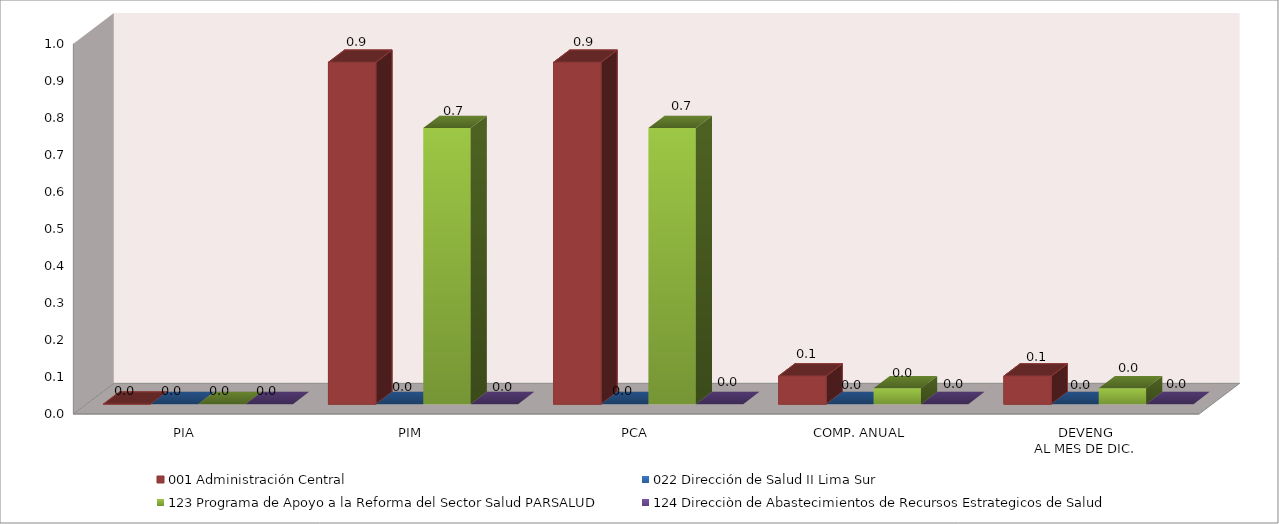
| Category | 001 Administración Central | 022 Dirección de Salud II Lima Sur | 123 Programa de Apoyo a la Reforma del Sector Salud PARSALUD | 124 Direcciòn de Abastecimientos de Recursos Estrategicos de Salud |
|---|---|---|---|---|
| PIA | 0 | 0 | 0 | 0 |
| PIM | 0.923 | 0 | 0.746 | 0 |
| PCA | 0.923 | 0 | 0.746 | 0 |
| COMP. ANUAL | 0.076 | 0 | 0.043 | 0 |
| DEVENG
AL MES DE DIC. | 0.076 | 0 | 0.043 | 0 |